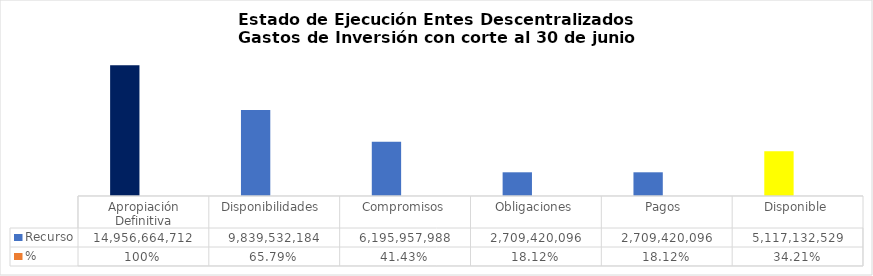
| Category | Recurso  | % |
|---|---|---|
| Apropiación Definitiva | 14956664712.39 | 1 |
| Disponibilidades  | 9839532183.66 | 0.658 |
| Compromisos | 6195957987.65 | 0.414 |
| Obligaciones | 2709420095.8 | 0.181 |
| Pagos  | 2709420095.8 | 0.181 |
| Disponible | 5117132528.73 | 0.342 |